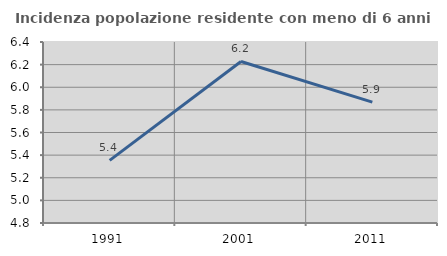
| Category | Incidenza popolazione residente con meno di 6 anni |
|---|---|
| 1991.0 | 5.354 |
| 2001.0 | 6.228 |
| 2011.0 | 5.868 |